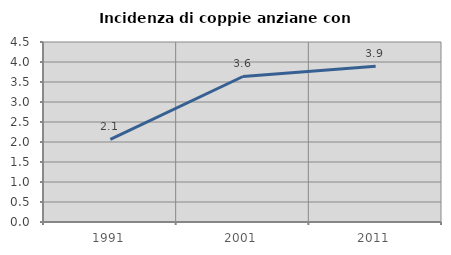
| Category | Incidenza di coppie anziane con figli |
|---|---|
| 1991.0 | 2.065 |
| 2001.0 | 3.638 |
| 2011.0 | 3.892 |